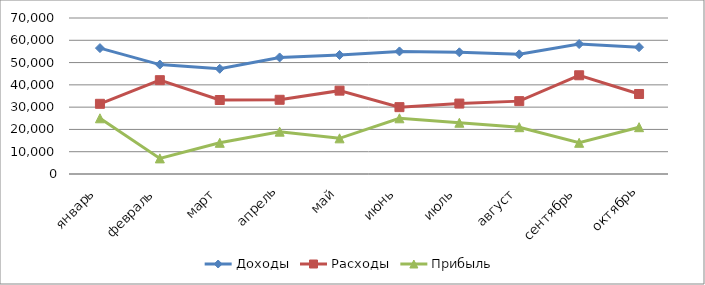
| Category | Доходы | Расходы | Прибыль |
|---|---|---|---|
| январь | 56500 | 31500 | 25000 |
| февраль | 49100 | 42100 | 7000 |
| март | 47200 | 33200 | 14000 |
| апрель | 52300 | 33300 | 19000 |
| май | 53400 | 37400 | 16000 |
| июнь | 55000 | 30000 | 25000 |
| июль | 54600 | 31600 | 23000 |
| август | 53700 | 32700 | 21000 |
| сентябрь | 58300 | 44300 | 14000 |
| октябрь | 56900 | 35900 | 21000 |